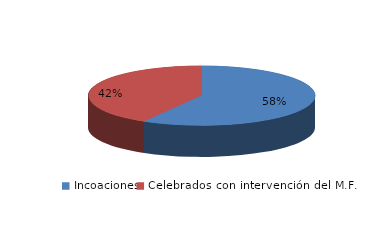
| Category | Series 0 |
|---|---|
| Incoaciones | 6018 |
| Celebrados con intervención del M.F. | 4283 |